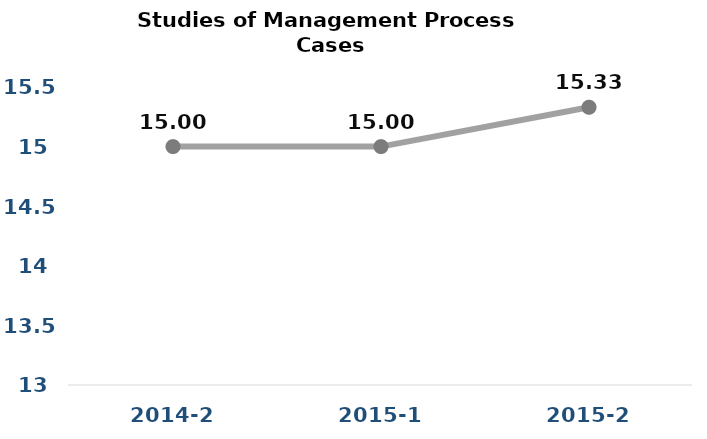
| Category | Series 0 |
|---|---|
| 2014-2 | 15 |
| 2015-1 | 15 |
| 2015-2 | 15.33 |